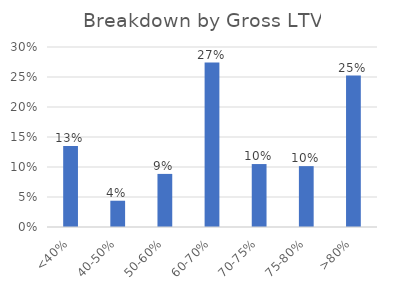
| Category | Series 0 |
|---|---|
| <40% | 0.135 |
| 40-50% | 0.044 |
| 50-60% | 0.088 |
| 60-70% | 0.274 |
| 70-75% | 0.105 |
| 75-80% | 0.101 |
| >80% | 0.252 |